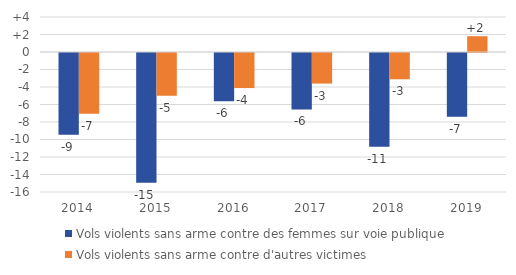
| Category | Vols violents sans arme contre des femmes sur voie publique | Vols violents sans arme contre d'autres victimes |
|---|---|---|
| 2014.0 | -9.34 | -6.949 |
| 2015.0 | -14.832 | -4.872 |
| 2016.0 | -5.514 | -4.007 |
| 2017.0 | -6.449 | -3.495 |
| 2018.0 | -10.706 | -3.007 |
| 2019.0 | -7.277 | 1.807 |